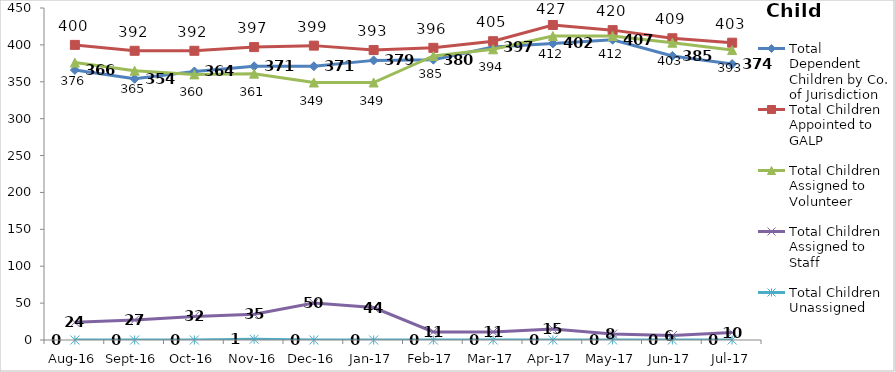
| Category | Total Dependent Children by Co. of Jurisdiction | Total Children Appointed to GALP | Total Children Assigned to Volunteer | Total Children Assigned to Staff | Total Children Unassigned |
|---|---|---|---|---|---|
| Aug-16 | 366 | 400 | 376 | 24 | 0 |
| Sep-16 | 354 | 392 | 365 | 27 | 0 |
| Oct-16 | 364 | 392 | 360 | 32 | 0 |
| Nov-16 | 371 | 397 | 361 | 35 | 1 |
| Dec-16 | 371 | 399 | 349 | 50 | 0 |
| Jan-17 | 379 | 393 | 349 | 44 | 0 |
| Feb-17 | 380 | 396 | 385 | 11 | 0 |
| Mar-17 | 397 | 405 | 394 | 11 | 0 |
| Apr-17 | 402 | 427 | 412 | 15 | 0 |
| May-17 | 407 | 420 | 412 | 8 | 0 |
| Jun-17 | 385 | 409 | 403 | 6 | 0 |
| Jul-17 | 374 | 403 | 393 | 10 | 0 |